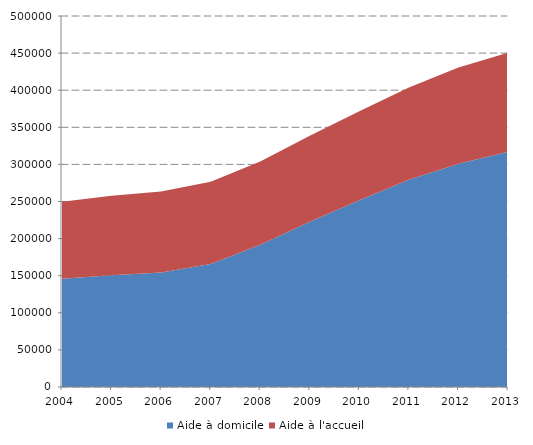
| Category | Aide à domicile | Aide à l'accueil |
|---|---|---|
| 2004.0 | 146013.369 | 103606.55 |
| 2005.0 | 150689.883 | 107106.96 |
| 2006.0 | 154471.169 | 109035.674 |
| 2007.0 | 165919.372 | 110603.514 |
| 2008.0 | 191783.534 | 112276.019 |
| 2009.0 | 222772.942 | 115962.332 |
| 2010.0 | 251693.989 | 119916.213 |
| 2011.0 | 279239.56 | 124250.09 |
| 2012.0 | 300946.22 | 129527.302 |
| 2013.0 | 317200.738 | 133506.208 |